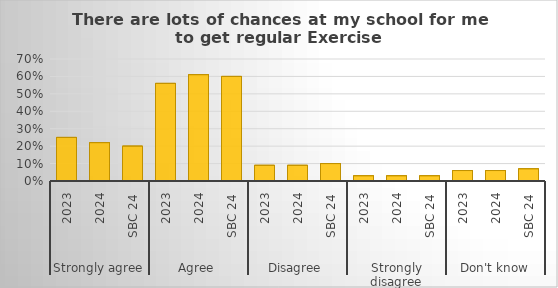
| Category | There are lots of chances at my school for me to get regular exercise |
|---|---|
| 0 | 0.25 |
| 1 | 0.22 |
| 2 | 0.2 |
| 3 | 0.56 |
| 4 | 0.61 |
| 5 | 0.6 |
| 6 | 0.09 |
| 7 | 0.09 |
| 8 | 0.1 |
| 9 | 0.03 |
| 10 | 0.03 |
| 11 | 0.03 |
| 12 | 0.06 |
| 13 | 0.06 |
| 14 | 0.07 |